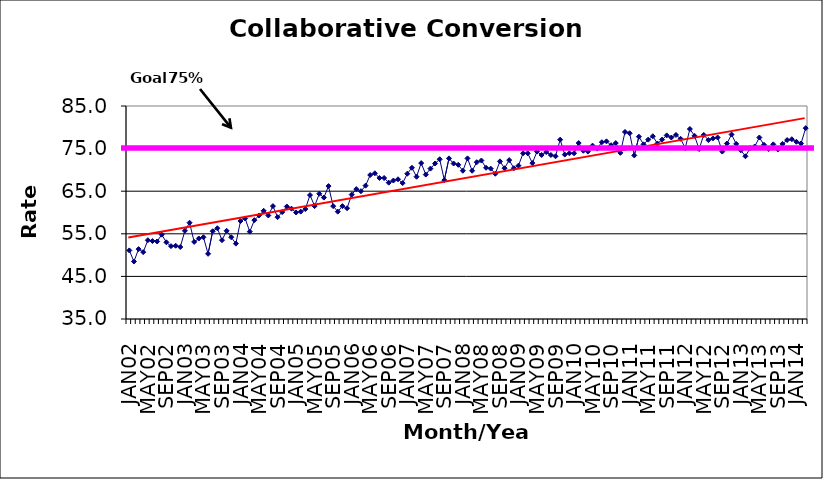
| Category | Series 0 |
|---|---|
| JAN02 | 51.1 |
| FEB02 | 48.5 |
| MAR02 | 51.4 |
| APR02 | 50.7 |
| MAY02 | 53.5 |
| JUN02 | 53.3 |
| JUL02 | 53.2 |
| AUG02 | 54.8 |
| SEP02 | 53 |
| OCT02 | 52.1 |
| NOV02 | 52.2 |
| DEC02 | 51.9 |
| JAN03 | 55.7 |
| FEB03 | 57.6 |
| MAR03 | 53.1 |
| APR03 | 53.9 |
| MAY03 | 54.2 |
| JUN03 | 50.3 |
| JUL03 | 55.6 |
| AUG03 | 56.3 |
| SEP03 | 53.5 |
| OCT03 | 55.7 |
| NOV03 | 54.2 |
| DEC03 | 52.7 |
| JAN04 | 58 |
| FEB04 | 58.6 |
| MAR04 | 55.5 |
| APR04 | 58.2 |
| MAY04 | 59.3 |
| JUN04 | 60.4 |
| JUL04 | 59.3 |
| AUG04 | 61.5 |
| SEP04 | 58.9 |
| OCT04 | 60.1 |
| NOV04 | 61.4 |
| DEC04 | 60.9 |
| JAN05 | 60 |
| FEB05 | 60.2 |
| MAR05 | 60.8 |
| APR05 | 64.1 |
| MAY05 | 61.5 |
| JUN05 | 64.4 |
| JUL05 | 63.5 |
| AUG05 | 66.2 |
| SEP05 | 61.5 |
| OCT05 | 60.2 |
| NOV05 | 61.5 |
| DEC05 | 61 |
| JAN06 | 64.2 |
| FEB06 | 65.5 |
| MAR06 | 65 |
| APR06 | 66.3 |
| MAY06 | 68.8 |
| JUN06 | 69.2 |
| JUL06 | 68.1 |
| AUG06 | 68.1 |
| SEP06 | 67 |
| OCT06 | 67.5 |
| NOV06 | 67.8 |
| DEC06 | 66.9 |
| JAN07 | 69.1 |
| FEB07 | 70.5 |
| MAR07 | 68.4 |
| APR07 | 71.6 |
| MAY07 | 68.9 |
| JUN07 | 70.3 |
| JUL07 | 71.5 |
| AUG07 | 72.5 |
| SEP07 | 67.6 |
| OCT07 | 72.7 |
| NOV07 | 71.5 |
| DEC07 | 71.2 |
| JAN08 | 69.8 |
| FEB08 | 72.7 |
| MAR08 | 69.8 |
| APR08 | 71.8 |
| MAY08 | 72.2 |
| JUN08 | 70.5 |
| JUL08 | 70.3 |
| AUG08 | 69.1 |
| SEP08 | 72 |
| OCT08 | 70.4 |
| NOV08 | 72.3 |
| DEC08 | 70.4 |
| JAN09 | 71 |
| FEB09 | 73.9 |
| MAR09 | 73.9 |
| APR09 | 71.6 |
| MAY09 | 74.3 |
| JUN09 | 73.5 |
| JUL09 | 74.2 |
| AUG09 | 73.5 |
| SEP09 | 73.2 |
| OCT09 | 77.1 |
| NOV09 | 73.6 |
| DEC09 | 73.9 |
| JAN10 | 73.9 |
| FEB10 | 76.3 |
| MAR10 | 74.5 |
| APR10 | 74.3 |
| MAY10 | 75.7 |
| JUN10 | 75 |
| JUL10 | 76.5 |
| AUG10 | 76.7 |
| SEP10 | 75.8 |
| OCT10 | 76.3 |
| NOV10 | 74 |
| DEC10 | 78.9 |
| JAN11 | 78.6 |
| FEB11 | 73.4 |
| MAR11 | 77.8 |
| APR11 | 76 |
| MAY11 | 77.1 |
| JUN11 | 77.9 |
| JUL11 | 76.2 |
| AUG11 | 77.1 |
| SEP11 | 78.1 |
| OCT11 | 77.6 |
| NOV11 | 78.2 |
| DEC11 | 77.3 |
| JAN12 | 75.1 |
| FEB12 | 79.6 |
| MAR12 | 78 |
| APR12 | 74.9 |
| MAY12 | 78.2 |
| JUN12 | 77 |
| JUL12 | 77.4 |
| AUG12 | 77.6 |
| SEP12 | 74.3 |
| OCT12 | 76.2 |
| NOV12 | 78.3 |
| DEC12 | 76.1 |
| JAN13 | 74.6 |
| FEB13 | 73.2 |
| MAR13 | 75.1 |
| APR13 | 75.5 |
| MAY13 | 77.6 |
| JUN13 | 75.9 |
| JUL13 | 74.9 |
| AUG13 | 76 |
| SEP13 | 74.8 |
| OCT13 | 76.1 |
| NOV13 | 77 |
| DEC13 | 77.2 |
| JAN14 | 76.6 |
| FEB14 | 76.2 |
| MAR14 | 79.8 |